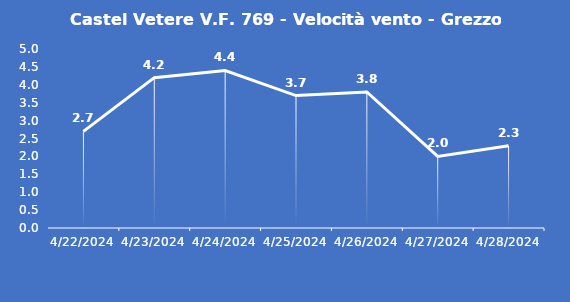
| Category | Castel Vetere V.F. 769 - Velocità vento - Grezzo (m/s) |
|---|---|
| 4/22/24 | 2.7 |
| 4/23/24 | 4.2 |
| 4/24/24 | 4.4 |
| 4/25/24 | 3.7 |
| 4/26/24 | 3.8 |
| 4/27/24 | 2 |
| 4/28/24 | 2.3 |